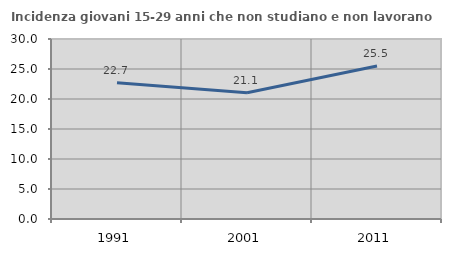
| Category | Incidenza giovani 15-29 anni che non studiano e non lavorano  |
|---|---|
| 1991.0 | 22.714 |
| 2001.0 | 21.053 |
| 2011.0 | 25.49 |